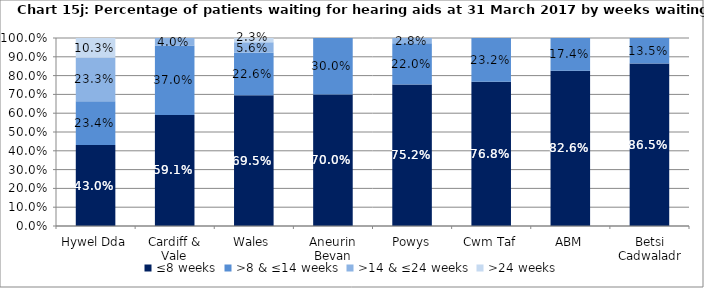
| Category | ≤8 weeks | >8 & ≤14 weeks | >14 & ≤24 weeks | >24 weeks |
|---|---|---|---|---|
| Hywel Dda | 0.43 | 0.234 | 0.233 | 0.103 |
| Cardiff & Vale | 0.591 | 0.37 | 0.04 | 0 |
| Wales | 0.695 | 0.226 | 0.056 | 0.023 |
| Aneurin Bevan | 0.7 | 0.3 | 0 | 0 |
| Powys | 0.752 | 0.22 | 0.028 | 0 |
| Cwm Taf | 0.768 | 0.232 | 0 | 0 |
| ABM | 0.826 | 0.174 | 0 | 0 |
| Betsi Cadwaladr | 0.865 | 0.135 | 0 | 0 |